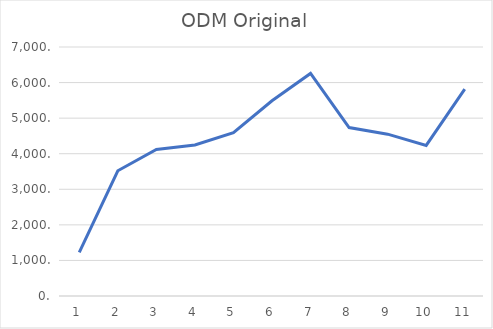
| Category | Series 0 |
|---|---|
| 0 | 1224.5 |
| 1 | 3520.9 |
| 2 | 4118.7 |
| 3 | 4245.4 |
| 4 | 4594.5 |
| 5 | 5488.2 |
| 6 | 6257.2 |
| 7 | 4736.2 |
| 8 | 4549.3 |
| 9 | 4232.7 |
| 10 | 5816 |